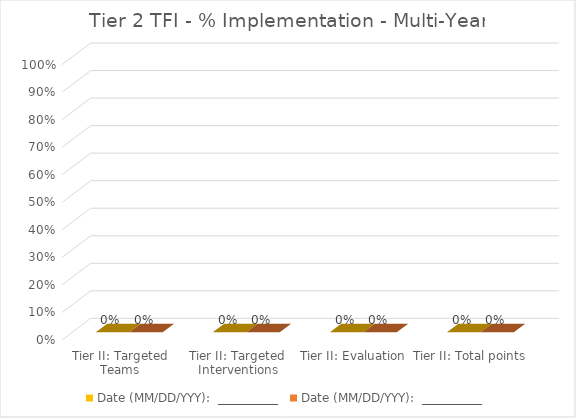
| Category | Date (MM/DD/YYY):  __________ | Series 1 |
|---|---|---|
| Tier II: Targeted Teams | 0 |  |
| Tier II: Targeted Interventions | 0 |  |
| Tier II: Evaluation | 0 |  |
| Tier II: Total points | 0 |  |